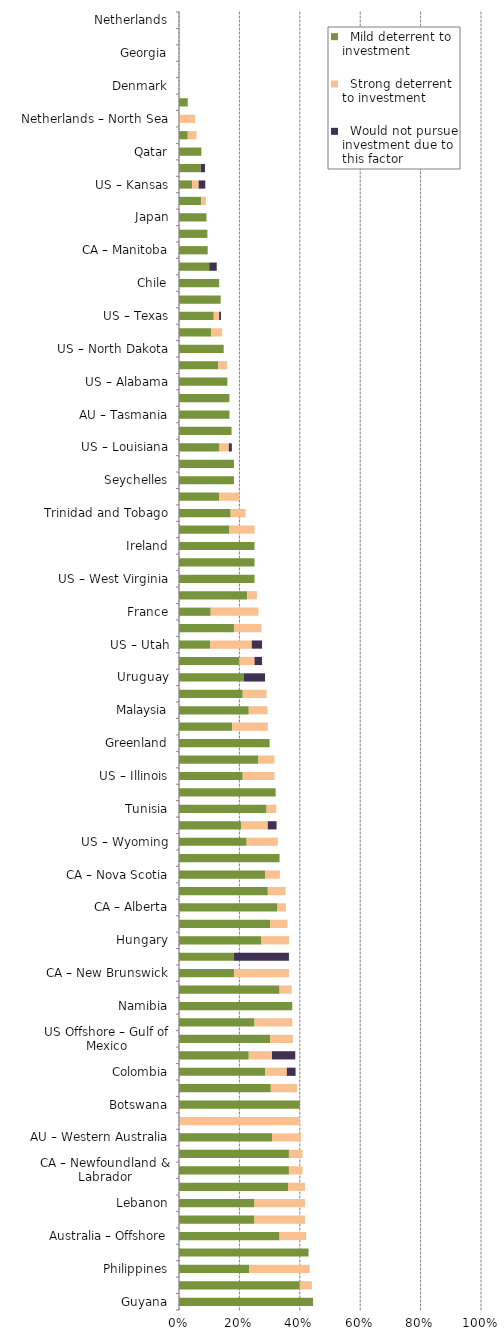
| Category |   Mild deterrent to investment |   Strong deterrent to investment |   Would not pursue investment due to this factor |
|---|---|---|---|
| Guyana | 0.444 | 0 | 0 |
| Kenya | 0.4 | 0.04 | 0 |
| Philippines | 0.233 | 0.2 | 0 |
| Niger | 0.429 | 0 | 0 |
| Australia – Offshore | 0.333 | 0.088 | 0 |
| Israel | 0.25 | 0.167 | 0 |
| Lebanon | 0.25 | 0.167 | 0 |
| US – Pennsylvania | 0.361 | 0.056 | 0 |
| CA – Newfoundland & Labrador | 0.364 | 0.045 | 0 |
| US – Michigan | 0.364 | 0.045 | 0 |
| AU – Western Australia | 0.308 | 0.096 | 0 |
| Kyrgyzstan | 0 | 0.4 | 0 |
| Botswana | 0.4 | 0 | 0 |
| South Africa | 0.304 | 0.087 | 0 |
| Colombia | 0.286 | 0.071 | 0.029 |
| Poland | 0.231 | 0.077 | 0.077 |
| US Offshore – Gulf of Mexico | 0.302 | 0.075 | 0 |
| CA – Yukon | 0.25 | 0.125 | 0 |
| Namibia | 0.375 | 0 | 0 |
| CA – British Columbia | 0.333 | 0.04 | 0 |
| CA – New Brunswick | 0.182 | 0.182 | 0 |
| Cyprus | 0.182 | 0 | 0.182 |
| Hungary | 0.273 | 0.091 | 0 |
| Thailand | 0.302 | 0.057 | 0 |
| CA – Alberta | 0.326 | 0.028 | 0 |
| Azerbaijan | 0.294 | 0.059 | 0 |
| CA – Nova Scotia | 0.286 | 0.048 | 0 |
| Jordan | 0.333 | 0 | 0 |
| US – Wyoming | 0.224 | 0.103 | 0 |
| New Zealand | 0.206 | 0.088 | 0.029 |
| Tunisia | 0.29 | 0.032 | 0 |
| Brunei | 0.32 | 0 | 0 |
| US – Illinois | 0.211 | 0.105 | 0 |
| Morocco | 0.263 | 0.053 | 0 |
| Greenland | 0.3 | 0 | 0 |
| AU – South Australia | 0.176 | 0.118 | 0 |
| Malaysia | 0.231 | 0.062 | 0 |
| US – New Mexico | 0.211 | 0.079 | 0 |
| Uruguay | 0.214 | 0 | 0.071 |
| US – Montana | 0.2 | 0.05 | 0.025 |
| US – Utah | 0.103 | 0.138 | 0.034 |
| Turkmenistan | 0.182 | 0.091 | 0 |
| France | 0.105 | 0.158 | 0 |
| US – Ohio | 0.226 | 0.032 | 0 |
| US – West Virginia | 0.25 | 0 | 0 |
| AU – Northern Territory | 0.25 | 0 | 0 |
| Ireland | 0.25 | 0 | 0 |
| Kuwait | 0.167 | 0.083 | 0 |
| Trinidad and Tobago | 0.171 | 0.049 | 0 |
| Germany | 0.133 | 0.067 | 0 |
| Seychelles | 0.182 | 0 | 0 |
| Bahrain | 0.182 | 0 | 0 |
| US – Louisiana | 0.134 | 0.031 | 0.01 |
| Turkey | 0.174 | 0 | 0 |
| AU – Tasmania | 0.167 | 0 | 0 |
| Oman | 0.167 | 0 | 0 |
| US – Alabama | 0.16 | 0 | 0 |
| United Kingdom | 0.13 | 0.029 | 0 |
| US – North Dakota | 0.148 | 0 | 0 |
| US – Arkansas | 0.107 | 0.036 | 0 |
| US – Texas | 0.115 | 0.018 | 0.006 |
| CA – Saskatchewan | 0.138 | 0 | 0 |
| Chile | 0.133 | 0 | 0 |
| US – Mississippi | 0.1 | 0 | 0.025 |
| CA – Manitoba | 0.095 | 0 | 0 |
| United Arab Emirates | 0.094 | 0 | 0 |
| Japan | 0.091 | 0 | 0 |
| United Kingdom – North Sea | 0.074 | 0.015 | 0 |
| US – Kansas | 0.043 | 0.022 | 0.022 |
| US – Oklahoma | 0.072 | 0 | 0.014 |
| Qatar | 0.074 | 0 | 0 |
| Norway – North Sea | 0.029 | 0.029 | 0 |
| Netherlands – North Sea | 0 | 0.053 | 0 |
| Norway | 0.029 | 0 | 0 |
| Denmark | 0 | 0 | 0 |
| Faroe Islands | 0 | 0 | 0 |
| Georgia | 0 | 0 | 0 |
| Malta | 0 | 0 | 0 |
| Netherlands | 0 | 0 | 0 |